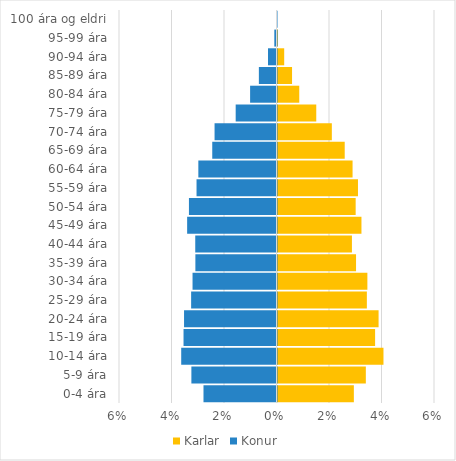
| Category | Karlar | Konur |
|---|---|---|
| 0-4 ára | 0.029 | -0.028 |
| 5-9 ára | 0.034 | -0.032 |
| 10-14 ára | 0.04 | -0.036 |
| 15-19 ára | 0.037 | -0.035 |
| 20-24 ára | 0.039 | -0.035 |
| 25-29 ára | 0.034 | -0.033 |
| 30-34 ára | 0.034 | -0.032 |
| 35-39 ára | 0.03 | -0.031 |
| 40-44 ára | 0.028 | -0.031 |
| 45-49 ára | 0.032 | -0.034 |
| 50-54 ára | 0.03 | -0.033 |
| 55-59 ára | 0.031 | -0.03 |
| 60-64 ára | 0.029 | -0.03 |
| 65-69 ára | 0.026 | -0.024 |
| 70-74 ára | 0.021 | -0.024 |
| 75-79 ára | 0.015 | -0.016 |
| 80-84 ára | 0.008 | -0.01 |
| 85-89 ára | 0.006 | -0.007 |
| 90-94 ára | 0.003 | -0.003 |
| 95-99 ára | 0 | -0.001 |
| 100 ára og eldri | 0 | 0 |